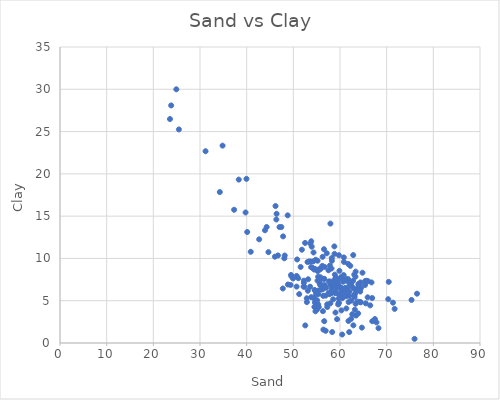
| Category | Series 0 |
|---|---|
| 59.217915737824356 | 6.778 |
| 62.79661086239625 | 7.344 |
| 62.60411205803756 | 6.632 |
| 63.96255402994081 | 6.889 |
| 61.465323986502455 | 7.554 |
| 64.82057558026459 | 8.31 |
| 66.9174492084268 | 2.573 |
| 56.27553455815904 | 10.187 |
| 59.63865832222597 | 6.917 |
| 37.30676374523785 | 15.752 |
| 55.3171345321932 | 7.827 |
| 65.51959920433367 | 4.687 |
| 75.97419523777207 | 0.49 |
| 62.63397121826816 | 3.404 |
| 54.255137447908005 | 9.645 |
| 63.0612253091587 | 6.411 |
| 65.39653571286917 | 7.327 |
| 64.4834251657713 | 6.497 |
| 66.88404263409433 | 5.317 |
| 62.20345659876291 | 7.217 |
| 63.35580447378949 | 8.439 |
| 46.41320978756604 | 15.279 |
| 70.44860161000634 | 7.227 |
| 62.830804892375895 | 10.397 |
| 55.52060689781707 | 8.734 |
| 55.33382839620918 | 4.562 |
| 61.97097278197134 | 5.576 |
| 58.24892989301533 | 7.003 |
| 55.70815587082542 | 7.452 |
| 60.31399974034164 | 6.499 |
| 62.37568476575746 | 7.066 |
| 55.81572774616919 | 7.776 |
| 61.46995383941842 | 7.345 |
| 65.99781457294556 | 7.313 |
| 61.75510039997499 | 7.548 |
| 61.851837566736705 | 4.839 |
| 59.771024519120864 | 10.38 |
| 75.32924198066479 | 5.092 |
| 58.23974753069161 | 10.043 |
| 52.25411995361914 | 7.108 |
| 51.25904292285157 | 5.782 |
| 64.34479666486696 | 6.087 |
| 56.92932366416845 | 5.603 |
| 59.60129848119286 | 7.437 |
| 62.04000213642096 | 6.057 |
| 60.203927188992054 | 6.555 |
| 58.89247480998879 | 7.525 |
| 62.08487306535658 | 6.971 |
| 63.84892552903648 | 6.453 |
| 60.79025768037222 | 8.028 |
| 57.16527152282255 | 10.607 |
| 58.791308166559205 | 11.423 |
| 76.50247743694636 | 5.831 |
| 58.826784900958614 | 10.54 |
| 54.634171166336486 | 4.766 |
| 61.97129243807171 | 1.292 |
| 67.82056620763888 | 2.437 |
| 58.52578052258971 | 6.614 |
| 54.48816867400476 | 8.681 |
| 58.894217394390395 | 8.083 |
| 54.75749124581994 | 4.884 |
| 59.03546449914116 | 3.603 |
| 63.64719377032131 | 6.254 |
| 63.97278760977857 | 6.98 |
| 60.82612080038531 | 7.587 |
| 56.703523106991334 | 8.996 |
| 59.23527849457227 | 7.034 |
| 64.38007500530786 | 7.166 |
| 46.70606426148378 | 10.351 |
| 56.443348847144044 | 1.583 |
| 58.30144337220048 | 6.584 |
| 61.813824551865814 | 2.605 |
| 55.44856806489596 | 4.251 |
| 57.57359544664937 | 5.918 |
| 61.300004008068086 | 5.517 |
| 55.18936634143292 | 7.375 |
| 59.73887576458316 | 4.718 |
| 64.44753851794152 | 4.809 |
| 63.3112462340012 | 7.836 |
| 65.92348095895572 | 5.401 |
| 54.7851019540848 | 9.843 |
| 59.15677625486327 | 5.98 |
| 55.85005927682035 | 8.746 |
| 52.559854931196384 | 2.077 |
| 54.51034322740597 | 4.266 |
| 59.69719875978142 | 5.758 |
| 50.71116398289522 | 7.93 |
| 55.33900920442309 | 6.202 |
| 58.237003796376555 | 6.317 |
| 55.07468891324808 | 3.962 |
| 53.176912398726465 | 7.537 |
| 57.06974054934853 | 6.531 |
| 64.29809810974145 | 4.852 |
| 63.117595350396954 | 5.427 |
| 61.559153484339475 | 6.502 |
| 54.07589553951222 | 8.888 |
| 66.75081519842684 | 7.164 |
| 40.87290301650739 | 10.783 |
| 47.745261717220394 | 6.444 |
| 59.374875552891616 | 2.819 |
| 53.59430211384468 | 6.659 |
| 52.878536627107664 | 5.289 |
| 56.93381402932665 | 1.443 |
| 54.83273742194218 | 5.749 |
| 52.34965050371007 | 6.658 |
| 55.10518261750419 | 5.058 |
| 58.20441911785345 | 5.908 |
| 62.41882341154573 | 5.016 |
| 63.04554216018669 | 5.61 |
| 62.39794269619467 | 2.864 |
| 58.01251592355006 | 6.927 |
| 52.261478442640595 | 7.371 |
| 46.05200159759874 | 10.203 |
| 56.34210579842816 | 3.763 |
| 63.89276366337549 | 3.497 |
| 54.740963399752275 | 3.748 |
| 53.10902179591087 | 6.179 |
| 57.25939329980323 | 4.571 |
| 56.615902299570386 | 2.582 |
| 50.698473963222604 | 6.668 |
| 61.36419022432854 | 4.084 |
| 60.17465832222597 | 6.381 |
| 59.23196559853008 | 7.556 |
| 56.71268506890473 | 6.846 |
| 55.253924061585714 | 8.485 |
| 56.30949437322629 | 6.352 |
| 48.15197193520516 | 10.344 |
| 49.623627601374665 | 7.858 |
| 56.39057681204039 | 5.578 |
| 55.65947303459407 | 6.985 |
| 51.04824933742415 | 7.657 |
| 52.202458456020004 | 6.66 |
| 54.65210444641653 | 6.206 |
| 55.889867017438725 | 6.298 |
| 48.83833583227317 | 6.915 |
| 55.81546876686762 | 6.826 |
| 60.851055220785454 | 6.004 |
| 58.93138789175669 | 5.912 |
| 59.04445773908301 | 7.36 |
| 54.60145461167665 | 8.784 |
| 53.81965654683125 | 8.964 |
| 44.66387491781699 | 10.742 |
| 49.40201440077807 | 6.863 |
| 60.47762126469958 | 5.296 |
| 54.45960220670754 | 5.266 |
| 53.822966315467085 | 5.423 |
| 57.27499640124375 | 4.256 |
| 56.523414850127 | 7.586 |
| 49.94174709771515 | 7.63 |
| 52.901969019490345 | 4.837 |
| 64.68859430632928 | 1.819 |
| 63.214121425866594 | 5.803 |
| 58.5368771165948 | 5.167 |
| 53.726407666685745 | 9.623 |
| 57.986934160741775 | 7.269 |
| 58.01949031719139 | 6.901 |
| 42.67925609748232 | 12.26 |
| 61.50778073428127 | 5.895 |
| 63.34405105890477 | 4.639 |
| 57.778663730272505 | 5.764 |
| 56.25404917766428 | 6.825 |
| 57.93143889278249 | 4.688 |
| 60.675389455459865 | 5.678 |
| 59.26857858743513 | 6.473 |
| 51.56069901240416 | 8.992 |
| 67.4849468676687 | 2.833 |
| 60.38394561190948 | 5.634 |
| 60.214685280596285 | 5.607 |
| 48.785107573822884 | 15.093 |
| 47.43348427407023 | 13.711 |
| 57.83623873302261 | 9.157 |
| 39.76460178332444 | 15.435 |
| 63.7734536830481 | 4.891 |
| 59.73893551275341 | 4.763 |
| 53.04243889278249 | 9.577 |
| 56.571122152396946 | 11.089 |
| 61.750785632285655 | 9.351 |
| 58.177230197569735 | 8.81 |
| 59.52763271586729 | 7.009 |
| 60.81686328373783 | 10.117 |
| 68.25052863047699 | 1.752 |
| 63.06014068595682 | 8.083 |
| 53.83774502876652 | 12.029 |
| 47.80551123244053 | 12.606 |
| 43.924324592797 | 13.329 |
| 40.11199847019238 | 13.124 |
| 54.54804896597273 | 6.269 |
| 63.18040944208046 | 3.942 |
| 58.262152339222695 | 9.722 |
| 58.32145710400836 | 1.295 |
| 53.67014754706407 | 11.746 |
| 46.18411881329905 | 16.194 |
| 49.50671722363003 | 8.043 |
| 51.832763239992396 | 11.031 |
| 59.09003814987965 | 7.752 |
| 66.47895176087643 | 4.447 |
| 71.35023645717912 | 4.768 |
| 60.24008217915575 | 5.881 |
| 39.95712848907202 | 19.411 |
| 57.95056808408269 | 14.119 |
| 34.24548342730404 | 17.848 |
| 60.16769600523361 | 7.774 |
| 60.69208832332601 | 7.244 |
| 55.1934903171914 | 9.727 |
| 60.472923849894165 | 1.004 |
| 55.32643306135288 | 5.78 |
| 52.51973492961044 | 11.831 |
| 46.35623674593636 | 14.602 |
| 44.28231043760603 | 13.715 |
| 34.836545162560554 | 23.337 |
| 71.70823926704817 | 4.035 |
| 59.87331055784183 | 8.532 |
| 47.032950808264474 | 13.71 |
| 23.823244434623064 | 28.09 |
| 31.18783067684936 | 22.676 |
| 38.30581964906474 | 19.321 |
| 62.202780532183084 | 9.122 |
| 63.438833299010255 | 3.249 |
| 60.31249593692947 | 3.858 |
| 57.538099250061535 | 8.596 |
| 56.633555685099715 | 7.582 |
| 59.609491669203024 | 4.558 |
| 53.40100650039982 | 9.646 |
| 65.64830785861525 | 7.356 |
| 53.94203658617648 | 11.391 |
| 60.84309623809431 | 9.588 |
| 54.328639687617006 | 10.705 |
| 24.92923902657654 | 29.997 |
| 23.567773421010827 | 26.482 |
| 25.475673911290954 | 25.253 |
| 48.067425666220075 | 10.016 |
| 62.863532994455845 | 2.089 |
| 59.699397990912765 | 6.66 |
| 61.098049601047364 | 6.507 |
| 59.689537262182306 | 5.267 |
| 70.33513455137992 | 5.178 |
| 57.63247751401205 | 7.279 |
| 65.36657464204268 | 6.858 |
| 56.19601097981781 | 9.117 |
| 50.817891060094226 | 9.88 |